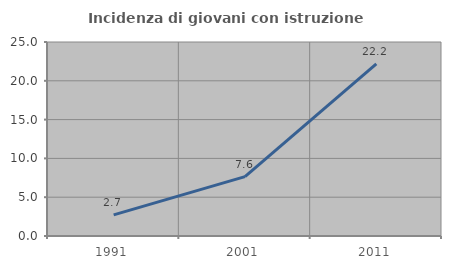
| Category | Incidenza di giovani con istruzione universitaria |
|---|---|
| 1991.0 | 2.724 |
| 2001.0 | 7.645 |
| 2011.0 | 22.195 |